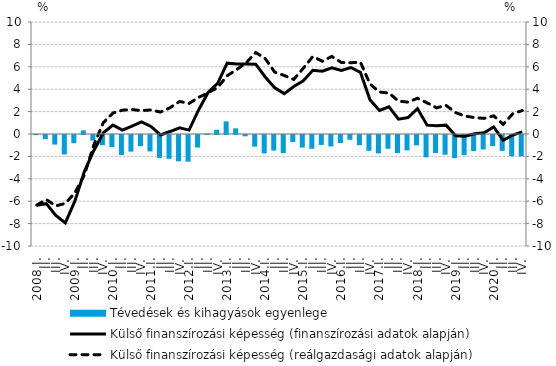
| Category | Tévedések és kihagyások egyenlege |
|---|---|
| 2008.I. | -0.014 |
| II. | -0.362 |
| III. | -0.854 |
| IV. | -1.737 |
| 2009.I. | -0.733 |
| II. | 0.322 |
| III. | -0.503 |
| IV. | -0.912 |
| 2010.I. | -1.082 |
| II. | -1.785 |
| III. | -1.488 |
| IV. | -0.997 |
| 2011.I. | -1.468 |
| II. | -2.043 |
| III. | -2.126 |
| IV. | -2.349 |
| 2012.I. | -2.383 |
| II. | -1.118 |
| III. | 0.036 |
| IV. | 0.376 |
| 2013.I. | 1.125 |
| II. | 0.504 |
| III. | -0.116 |
| IV. | -1.041 |
| 2014.I. | -1.648 |
| II. | -1.39 |
| III. | -1.617 |
| IV. | -0.632 |
| 2015.I. | -1.118 |
| II. | -1.23 |
| III. | -0.886 |
| IV. | -1.02 |
| 2016.I. | -0.716 |
| II. | -0.429 |
| III. | -0.91 |
| IV. | -1.412 |
| 2017.I. | -1.647 |
| II. | -1.228 |
| III. | -1.613 |
| IV. | -1.376 |
| 2018.I. | -0.924 |
| II. | -1.994 |
| III. | -1.61 |
| IV. | -1.764 |
| 2019.I. | -2.068 |
| II. | -1.796 |
| III. | -1.441 |
| IV. | -1.292 |
| 2020.I. | -0.992 |
| II. | -1.419 |
| III. | -1.901 |
| IV. | -1.909 |